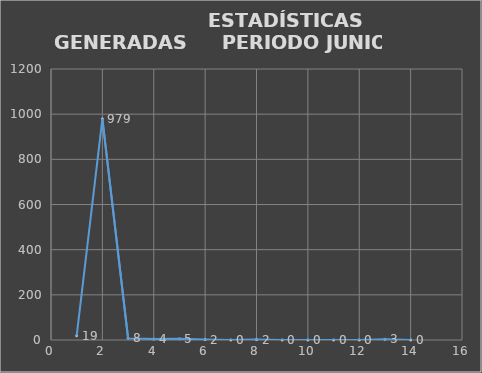
| Category |                   ESTADÍSTICAS GENERADAS  |
|---|---|
| 0 | 19 |
| 1 | 979 |
| 2 | 8 |
| 3 | 4 |
| 4 | 5 |
| 5 | 2 |
| 6 | 0 |
| 7 | 2 |
| 8 | 0 |
| 9 | 0 |
| 10 | 0 |
| 11 | 0 |
| 12 | 3 |
| 13 | 0 |